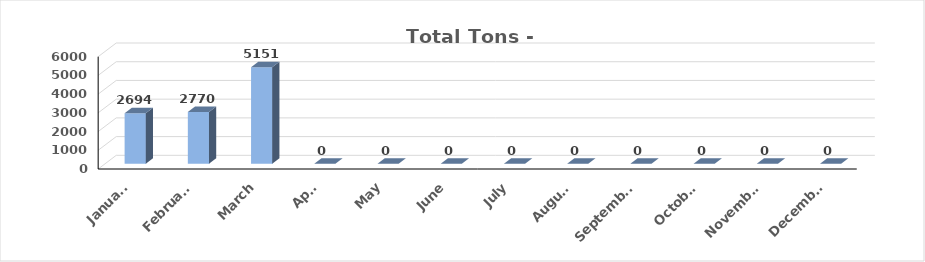
| Category | TONS |
|---|---|
| January | 2694 |
| February | 2770 |
| March | 5151 |
| April | 0 |
| May | 0 |
| June | 0 |
| July | 0 |
| August | 0 |
| September | 0 |
| October | 0 |
| November | 0 |
| December | 0 |